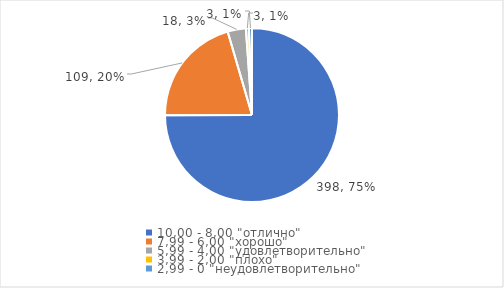
| Category | Series 0 | Series 1 |
|---|---|---|
| 10,00 - 8,00 "отлично" | 398 | 0.75 |
| 7,99 - 6,00 "хорошо" | 109 | 0.205 |
| 5,99 - 4,00 "удовлетворительно" | 18 | 0.034 |
| 3,99 - 2,00 "плохо" | 3 | 0.006 |
| 2,99 - 0 "неудовлетворительно" | 3 | 0.006 |